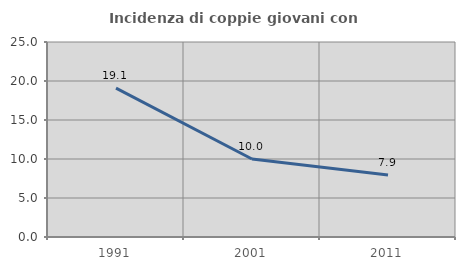
| Category | Incidenza di coppie giovani con figli |
|---|---|
| 1991.0 | 19.095 |
| 2001.0 | 10 |
| 2011.0 | 7.937 |